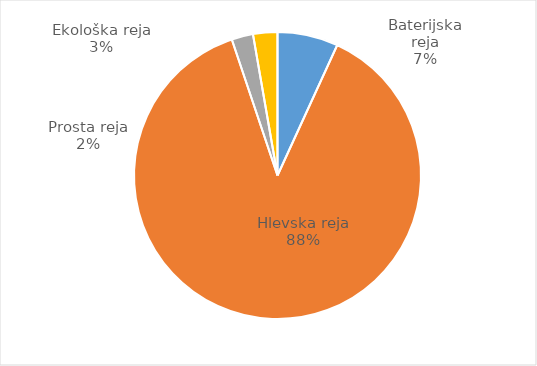
| Category | Količina kosov jajc |
|---|---|
| Baterijska reja | 221042 |
| Hlevska reja | 2845200 |
| Prosta reja | 78153 |
| Ekološka reja | 88560 |